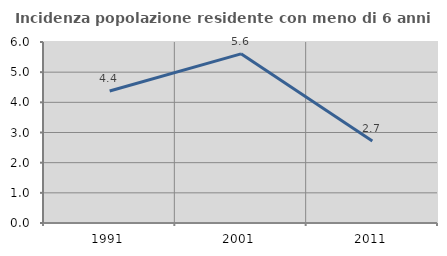
| Category | Incidenza popolazione residente con meno di 6 anni |
|---|---|
| 1991.0 | 4.375 |
| 2001.0 | 5.607 |
| 2011.0 | 2.719 |